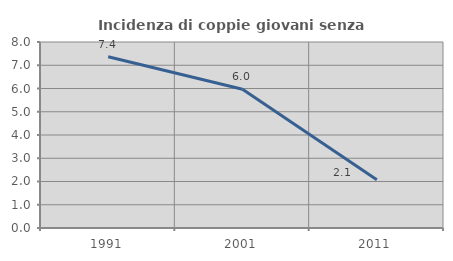
| Category | Incidenza di coppie giovani senza figli |
|---|---|
| 1991.0 | 7.368 |
| 2001.0 | 5.97 |
| 2011.0 | 2.073 |